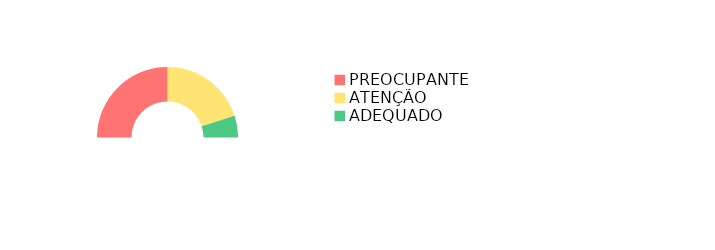
| Category | Velocimetro |
|---|---|
| PREOCUPANTE | 0.5 |
| ATENÇÃO | 0.4 |
| ADEQUADO | 0.1 |
| Fim | 1 |